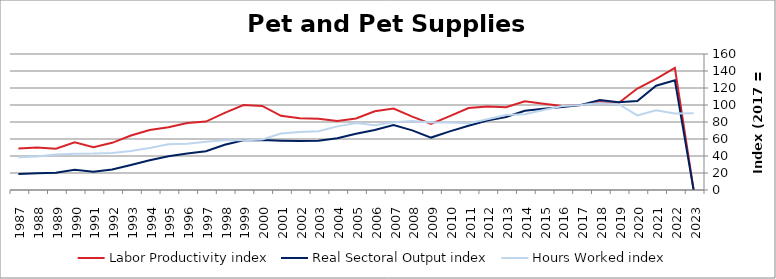
| Category | Labor Productivity index | Real Sectoral Output index | Hours Worked index |
|---|---|---|---|
| 2023.0 | 0 | 0 | 90.185 |
| 2022.0 | 143.663 | 129.125 | 89.88 |
| 2021.0 | 130.85 | 122.705 | 93.775 |
| 2020.0 | 119.413 | 104.775 | 87.741 |
| 2019.0 | 102.287 | 103.302 | 100.992 |
| 2018.0 | 103.461 | 105.767 | 102.229 |
| 2017.0 | 100 | 100 | 100 |
| 2016.0 | 98.8 | 97.572 | 98.757 |
| 2015.0 | 101.353 | 95.45 | 94.176 |
| 2014.0 | 104.391 | 93.145 | 89.227 |
| 2013.0 | 97.398 | 85.938 | 88.233 |
| 2012.0 | 98.152 | 81.64 | 83.177 |
| 2011.0 | 96.368 | 75.638 | 78.488 |
| 2010.0 | 86.851 | 68.945 | 79.382 |
| 2009.0 | 77.667 | 61.677 | 79.412 |
| 2008.0 | 86.406 | 70.112 | 81.143 |
| 2007.0 | 95.78 | 76.429 | 79.797 |
| 2006.0 | 92.64 | 70.652 | 76.266 |
| 2005.0 | 84.197 | 66.266 | 78.703 |
| 2004.0 | 81.286 | 60.835 | 74.841 |
| 2003.0 | 83.858 | 57.884 | 69.026 |
| 2002.0 | 84.494 | 57.569 | 68.134 |
| 2001.0 | 87.267 | 58.066 | 66.538 |
| 2000.0 | 98.875 | 58.807 | 59.476 |
| 1999.0 | 99.939 | 58.402 | 58.438 |
| 1998.0 | 90.792 | 53.2 | 58.595 |
| 1997.0 | 80.471 | 45.676 | 56.761 |
| 1996.0 | 78.899 | 42.86 | 54.323 |
| 1995.0 | 73.876 | 39.797 | 53.869 |
| 1994.0 | 70.672 | 34.89 | 49.369 |
| 1993.0 | 64.148 | 29.361 | 45.77 |
| 1992.0 | 55.488 | 24.195 | 43.604 |
| 1991.0 | 50.347 | 21.559 | 42.821 |
| 1990.0 | 56.145 | 23.935 | 42.631 |
| 1989.0 | 48.536 | 20.258 | 41.738 |
| 1988.0 | 50.141 | 19.786 | 39.46 |
| 1987.0 | 48.856 | 18.816 | 38.514 |